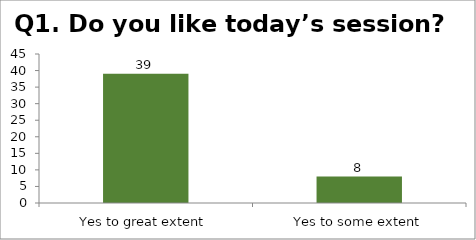
| Category | Q1. Do you like today’s session? |
|---|---|
| Yes to great extent | 39 |
| Yes to some extent | 8 |